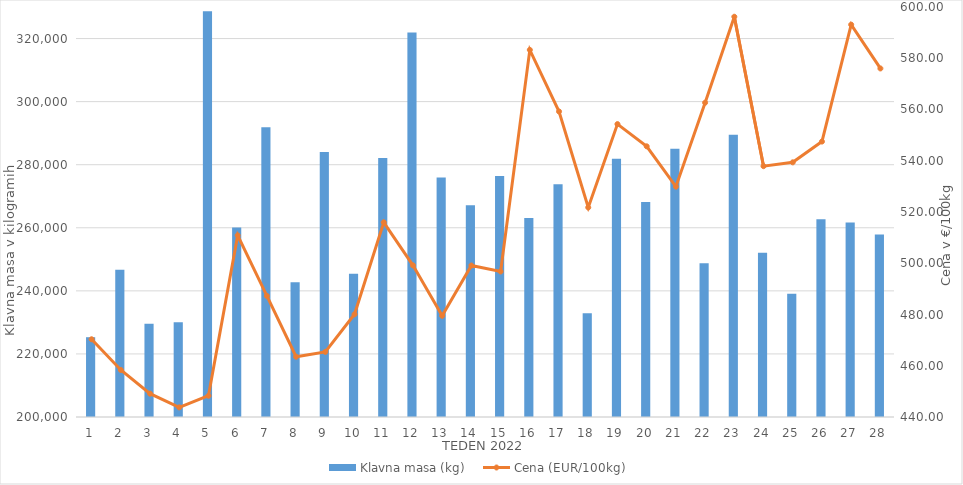
| Category | Klavna masa (kg) |
|---|---|
| 1.0 | 225300 |
| 2.0 | 246712 |
| 3.0 | 229541 |
| 4.0 | 230074 |
| 5.0 | 328640 |
| 6.0 | 260108 |
| 7.0 | 291887 |
| 8.0 | 242732 |
| 9.0 | 283987 |
| 10.0 | 245414 |
| 11.0 | 282092 |
| 12.0 | 321936 |
| 13.0 | 275950 |
| 14.0 | 267148 |
| 15.0 | 276417 |
| 16.0 | 263098 |
| 17.0 | 273824 |
| 18.0 | 232926 |
| 19.0 | 281859 |
| 20.0 | 268153 |
| 21.0 | 285073 |
| 22.0 | 248783 |
| 23.0 | 289478 |
| 24.0 | 252069 |
| 25.0 | 239099 |
| 26.0 | 262689 |
| 27.0 | 261656 |
| 28.0 | 257905 |